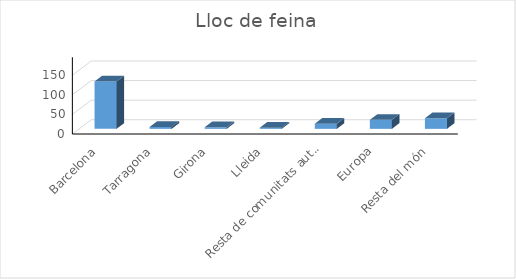
| Category | Series 0 |
|---|---|
| Barcelona | 121 |
| Tarragona | 5 |
| Girona | 4 |
| Lleida | 3 |
| Resta de comunitats autònomes | 13 |
| Europa | 23 |
| Resta del món | 27 |